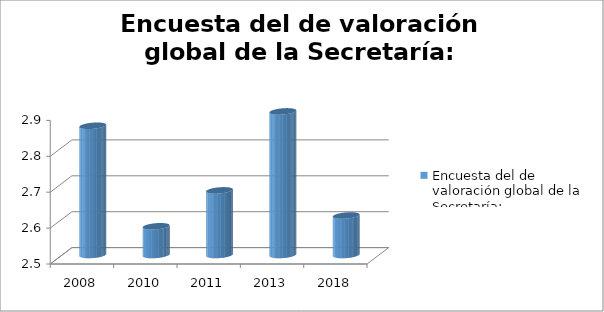
| Category | Encuesta del de valoración global de la Secretaría: |
|---|---|
| 2008.0 | 2.86 |
| 2010.0 | 2.58 |
| 2011.0 | 2.68 |
| 2013.0 | 2.9 |
| 2018.0 | 2.61 |